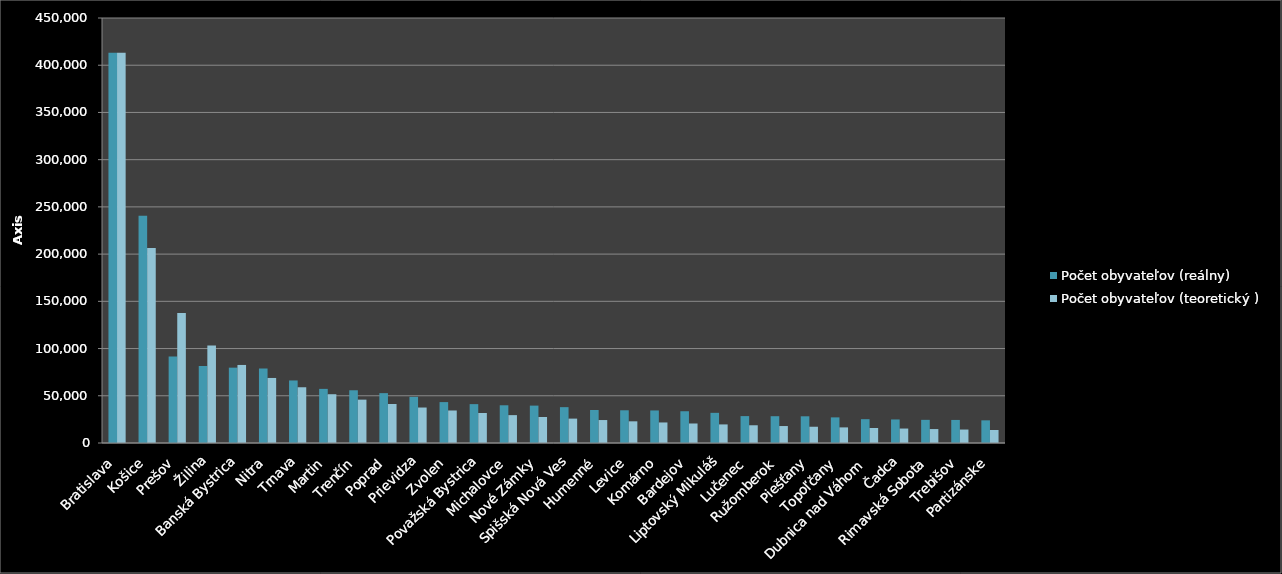
| Category | Počet obyvateľov (reálny) | Počet obyvateľov (teoretický ) |
|---|---|---|
| Bratislava | 413192 | 413192 |
| Košice | 240688 | 206596 |
| Prešov | 91638 | 137730.667 |
| Žilina | 81515 | 103298 |
| Banská Bystrica | 79775 | 82638.4 |
| Nitra | 78875 | 68865.333 |
| Trnava | 66219 | 59027.429 |
| Martin | 57300 | 51649 |
| Trenčín | 55832 | 45910.222 |
| Poprad | 52791 | 41319.2 |
| Prievidza | 48866 | 37562.909 |
| Zvolen | 43311 | 34432.667 |
| Považská Bystrica | 41153 | 31784 |
| Michalovce | 39940 | 29513.714 |
| Nové Zámky | 39585 | 27546.133 |
| Spišská Nová Ves | 37948 | 25824.5 |
| Humenné | 34913 | 24305.412 |
| Levice | 34649 | 22955.111 |
| Komárno | 34478 | 21746.947 |
| Bardejov | 33625 | 20659.6 |
| Liptovský Mikuláš | 31928 | 19675.81 |
| Lučenec | 28475 | 18781.455 |
| Ružomberok | 28364 | 17964.87 |
| Piešťany | 28267 | 17216.333 |
| Topoľčany | 27124 | 16527.68 |
| Dubnica nad Váhom | 25229 | 15892 |
| Čadca | 24921 | 15303.407 |
| Rimavská Sobota | 24505 | 14756.857 |
| Trebišov | 24408 | 14248 |
| Partizánske | 24006 | 13773.067 |